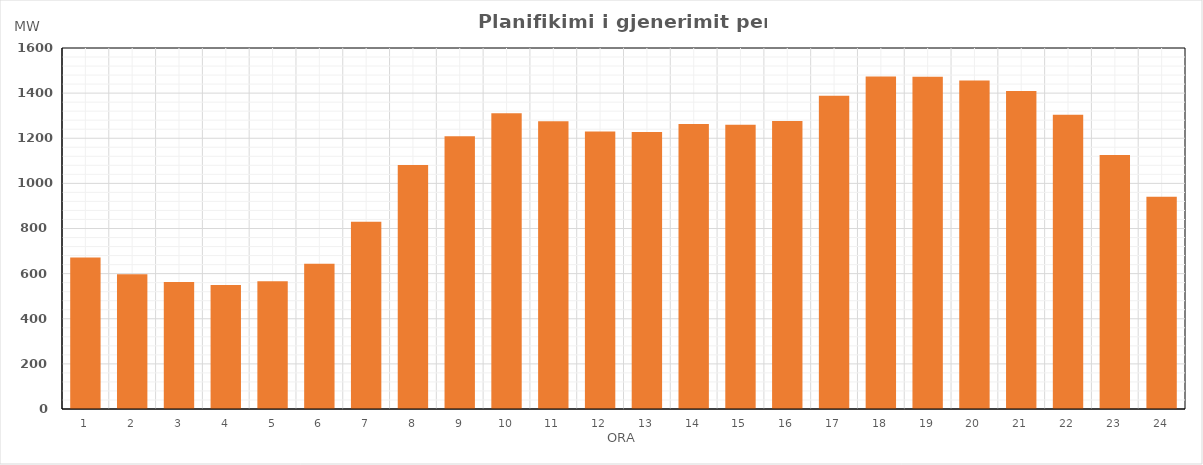
| Category | Max (MW) |
|---|---|
| 0 | 671.009 |
| 1 | 597.537 |
| 2 | 563.367 |
| 3 | 549.219 |
| 4 | 566.275 |
| 5 | 643.767 |
| 6 | 829.873 |
| 7 | 1081.83 |
| 8 | 1209.138 |
| 9 | 1310.782 |
| 10 | 1275.48 |
| 11 | 1230.212 |
| 12 | 1228.242 |
| 13 | 1263.353 |
| 14 | 1260.386 |
| 15 | 1276.474 |
| 16 | 1388.712 |
| 17 | 1473.35 |
| 18 | 1472.226 |
| 19 | 1456.154 |
| 20 | 1409.383 |
| 21 | 1303.742 |
| 22 | 1125.628 |
| 23 | 940.55 |